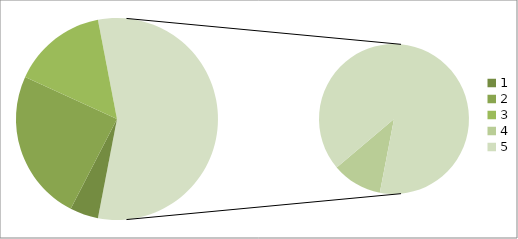
| Category | Series 0 |
|---|---|
| 0 | 3 |
| 1 | 16 |
| 2 | 10 |
| 3 | 4 |
| 4 | 33 |